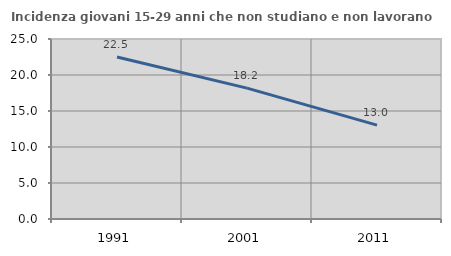
| Category | Incidenza giovani 15-29 anni che non studiano e non lavorano  |
|---|---|
| 1991.0 | 22.5 |
| 2001.0 | 18.182 |
| 2011.0 | 13.043 |